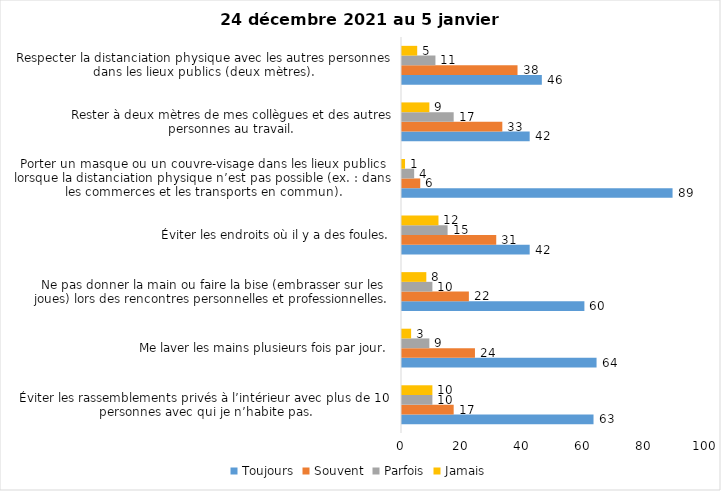
| Category | Toujours | Souvent | Parfois | Jamais |
|---|---|---|---|---|
| Éviter les rassemblements privés à l’intérieur avec plus de 10 personnes avec qui je n’habite pas. | 63 | 17 | 10 | 10 |
| Me laver les mains plusieurs fois par jour. | 64 | 24 | 9 | 3 |
| Ne pas donner la main ou faire la bise (embrasser sur les joues) lors des rencontres personnelles et professionnelles. | 60 | 22 | 10 | 8 |
| Éviter les endroits où il y a des foules. | 42 | 31 | 15 | 12 |
| Porter un masque ou un couvre-visage dans les lieux publics lorsque la distanciation physique n’est pas possible (ex. : dans les commerces et les transports en commun). | 89 | 6 | 4 | 1 |
| Rester à deux mètres de mes collègues et des autres personnes au travail. | 42 | 33 | 17 | 9 |
| Respecter la distanciation physique avec les autres personnes dans les lieux publics (deux mètres). | 46 | 38 | 11 | 5 |